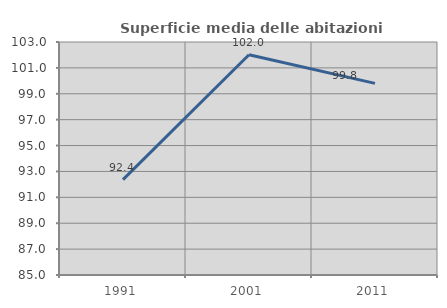
| Category | Superficie media delle abitazioni occupate |
|---|---|
| 1991.0 | 92.371 |
| 2001.0 | 102.018 |
| 2011.0 | 99.803 |